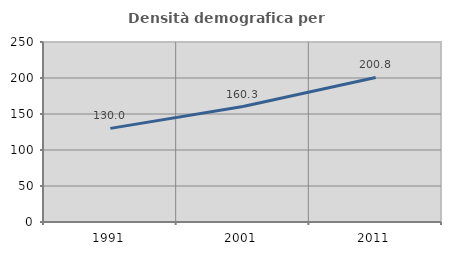
| Category | Densità demografica |
|---|---|
| 1991.0 | 130.049 |
| 2001.0 | 160.306 |
| 2011.0 | 200.767 |